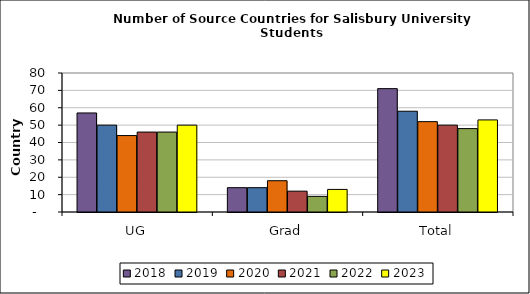
| Category | 2018 | 2019 | 2020 | 2021 | 2022 | 2023 |
|---|---|---|---|---|---|---|
| UG | 57 | 50 | 44 | 46 | 46 | 50 |
| Grad | 14 | 14 | 18 | 12 | 9 | 13 |
| Total | 71 | 58 | 52 | 50 | 48 | 53 |